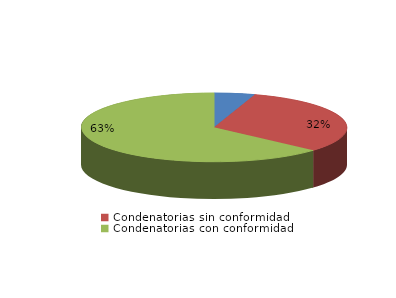
| Category | Series 0 |
|---|---|
| Absolutorias | 7 |
| Condenatorias sin conformidad | 45 |
| Condenatorias con conformidad | 90 |